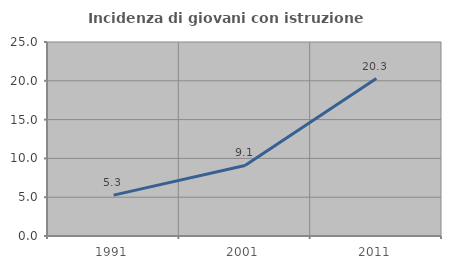
| Category | Incidenza di giovani con istruzione universitaria |
|---|---|
| 1991.0 | 5.263 |
| 2001.0 | 9.091 |
| 2011.0 | 20.29 |